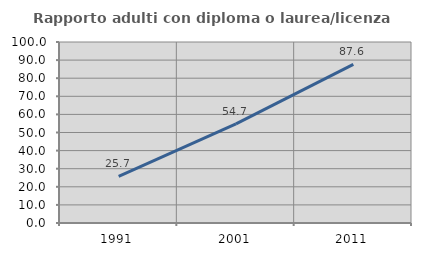
| Category | Rapporto adulti con diploma o laurea/licenza media  |
|---|---|
| 1991.0 | 25.694 |
| 2001.0 | 54.717 |
| 2011.0 | 87.619 |